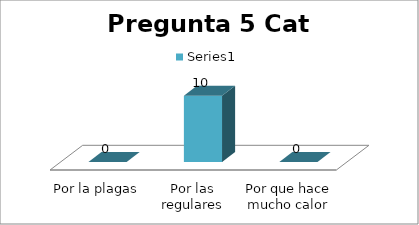
| Category | Series 0 |
|---|---|
| Por la plagas | 0 |
| Por las regulares condiciones | 10 |
| Por que hace mucho calor | 0 |